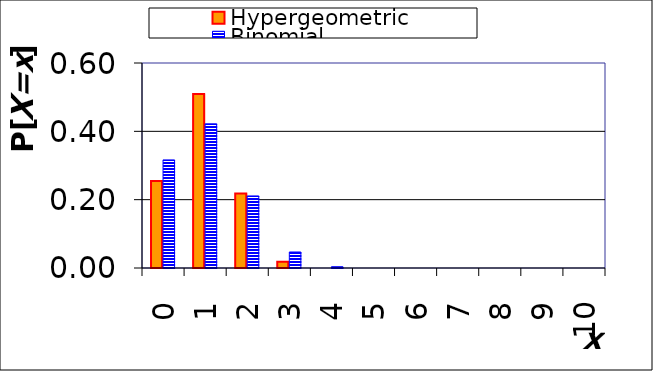
| Category | Hypergeometric | Binomial |
|---|---|---|
| 0.0 | 0.255 | 0.316 |
| 1.0 | 0.509 | 0.422 |
| 2.0 | 0.218 | 0.211 |
| 3.0 | 0.018 | 0.047 |
| 4.0 | 0 | 0.004 |
| 5.0 | 0 | 0 |
| 6.0 | 0 | 0 |
| 7.0 | 0 | 0 |
| 8.0 | 0 | 0 |
| 9.0 | 0 | 0 |
| 10.0 | 0 | 0 |